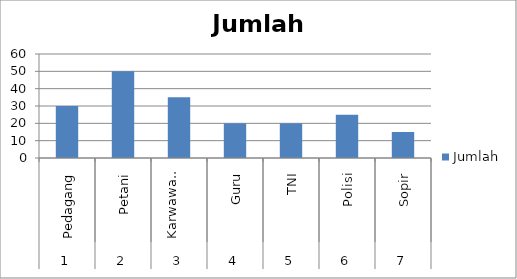
| Category | Jumlah |
|---|---|
| 0 | 30 |
| 1 | 50 |
| 2 | 35 |
| 3 | 20 |
| 4 | 20 |
| 5 | 25 |
| 6 | 15 |